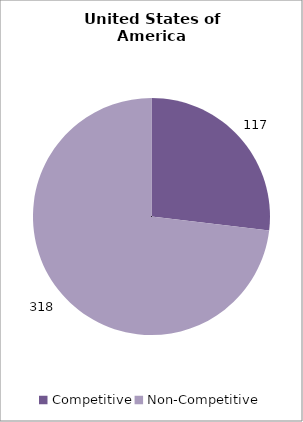
| Category | Series 0 |
|---|---|
| 0 | 117 |
| 1 | 318 |